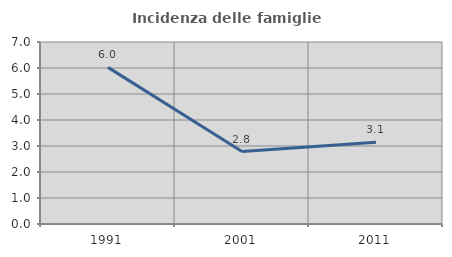
| Category | Incidenza delle famiglie numerose |
|---|---|
| 1991.0 | 6.024 |
| 2001.0 | 2.786 |
| 2011.0 | 3.145 |